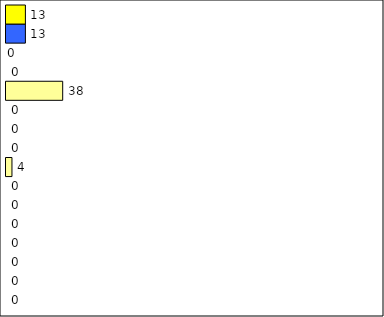
| Category | -2 | -1 | 0 | 1 | 2 | 3 | 4 | 5 | 6 | 7 | 8 | 9 | 10 | 11 | 12 | Perfect Round |
|---|---|---|---|---|---|---|---|---|---|---|---|---|---|---|---|---|
| 0 | 0 | 0 | 0 | 0 | 0 | 0 | 0 | 4 | 0 | 0 | 0 | 38 | 0 | 0 | 13 | 13 |